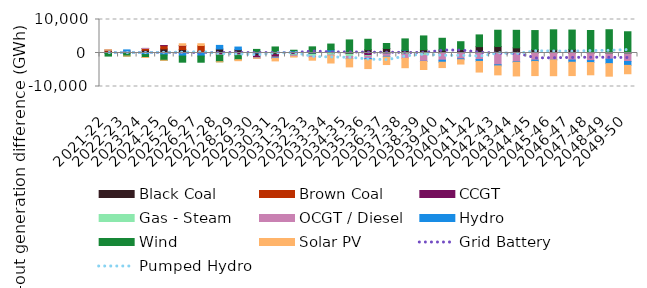
| Category | Black Coal | Brown Coal | CCGT | Gas - Steam | OCGT / Diesel | Hydro | Wind | Solar PV |
|---|---|---|---|---|---|---|---|---|
| 2021-22 | 540.035 | 391.499 | 0 | 1.803 | 1.642 | -0.7 | -918.105 | 0.001 |
| 2022-23 | 314.948 | 242.666 | 0 | 0.845 | 0.869 | 366.769 | -911.919 | 0 |
| 2023-24 | 826.726 | 514.197 | 15.991 | 1.987 | 5.205 | -474.259 | -867.51 | -4.17 |
| 2024-25 | 1208.096 | 987.118 | 5.643 | -22.756 | -42.799 | -507.137 | -1605.831 | -0.094 |
| 2025-26 | 1034.702 | 1131.22 | 99.648 | -20.04 | -28.363 | -855.413 | -1837.141 | 496.471 |
| 2026-27 | 524.518 | 1710.342 | -28.352 | -20.612 | -19.569 | -840.421 | -1841.941 | 532.211 |
| 2027-28 | 1189.99 | -0.005 | -515.663 | -59.866 | -64.696 | 1080.378 | -1967.188 | -40.281 |
| 2028-29 | 984.155 | -0.004 | -452.305 | -83.926 | -96.306 | 792.528 | -1368.765 | -290.939 |
| 2029-30 | -793.09 | -0.004 | -677.871 | -47.17 | -23.204 | 251.677 | 819.109 | -12.163 |
| 2030-31 | -491.022 | -0.004 | -736.877 | -129.144 | -131.981 | -122.369 | 1800.809 | -747.151 |
| 2031-32 | 103.215 | -0.003 | -503.721 | -283.469 | -271.146 | 517.533 | 206.971 | -147.052 |
| 2032-33 | -298.229 | -0.003 | -113.888 | -554.698 | -370.221 | 45.108 | 1788.756 | -809.743 |
| 2033-34 | 274.904 | -0.004 | -77.797 | -524.912 | -259.339 | 674.631 | 1722.593 | -2125.056 |
| 2034-35 | -136.195 | -0.003 | -219.7 | -661.843 | -679.143 | -28.276 | 3902.86 | -2417.643 |
| 2035-36 | 986.903 | -0.003 | -767.22 | -231.329 | -632.311 | -341.759 | 3114.715 | -2680.511 |
| 2036-37 | 1349.273 | -0.003 | -296.526 | -120.382 | -582.31 | -210.328 | 1486.563 | -2239.231 |
| 2037-38 | 798.389 | -0.003 | -212.88 | -195.355 | -1196.164 | 27.171 | 3384.38 | -2787.072 |
| 2038-39 | 964.59 | -0.003 | -171.292 | -498.742 | -1792.001 | -60.934 | 4129.92 | -2401.856 |
| 2039-40 | 875.952 | -0.003 | -140.385 | -6.165 | -1991.799 | -609.769 | 3520.277 | -1601.4 |
| 2040-41 | 1016.927 | -0.002 | -53.317 | -6.022 | -1681.805 | -264.808 | 2350.146 | -1291.186 |
| 2041-42 | 1901.037 | -0.003 | -86.703 | -1.624 | -1867.291 | -546.758 | 3499.8 | -3184.098 |
| 2042-43 | 1949.625 | -0.003 | -186.73 | -14.973 | -3308.184 | -341.264 | 4845.823 | -2675.184 |
| 2043-44 | 1539.39 | -0.003 | -93.747 | -6.685 | -2500.541 | -161.421 | 5232.945 | -4082.876 |
| 2044-45 | 998.222 | -0.003 | -40.818 | -7.353 | -2093.793 | -361.629 | 5700.698 | -4238.776 |
| 2045-46 | 945.357 | -0.001 | -14.577 | -5.676 | -2011.099 | -13.449 | 5975.632 | -4733.626 |
| 2046-47 | 1068.309 | -0.002 | 0 | 0 | -2110.733 | -645.745 | 5778.539 | -3983.821 |
| 2047-48 | 121.288 | 0 | 0 | 0 | -2263.164 | -593.452 | 6599.981 | -3649.81 |
| 2048-49 | 45.932 | 0 | 0 | 0 | -1831.701 | -1338.142 | 6899.416 | -3747.146 |
| 2049-50 | 26.382 | 0 | -0.001 | 0 | -2528.558 | -1167.607 | 6314.174 | -2495.039 |